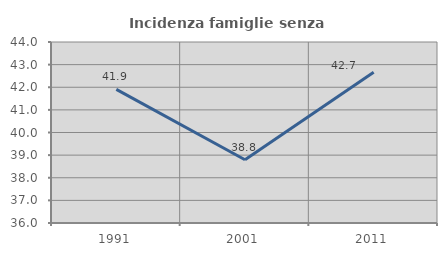
| Category | Incidenza famiglie senza nuclei |
|---|---|
| 1991.0 | 41.909 |
| 2001.0 | 38.793 |
| 2011.0 | 42.667 |